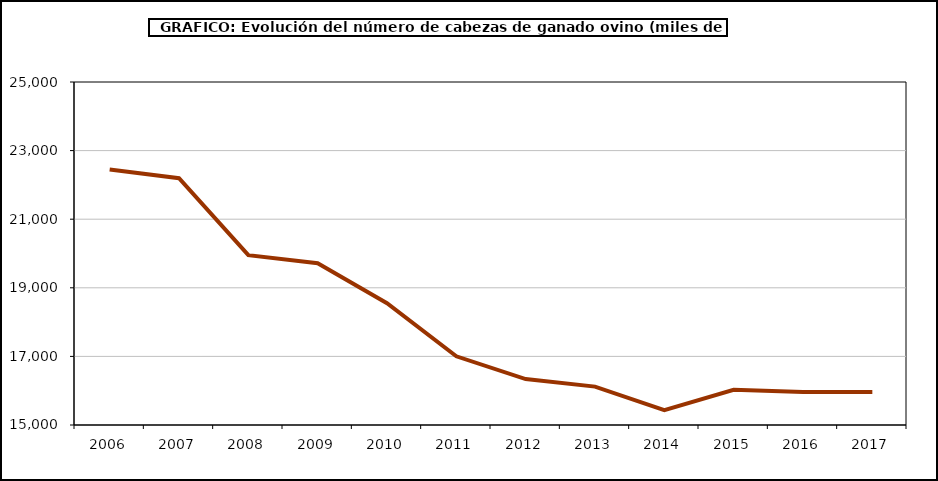
| Category | Series 0 |
|---|---|
| 2006.0 | 22451.627 |
| 2007.0 | 22194.257 |
| 2008.0 | 19952.282 |
| 2009.0 | 19718.195 |
| 2010.0 | 18552 |
| 2011.0 | 17003 |
| 2012.0 | 16339.373 |
| 2013.0 | 16118.586 |
| 2014.0 | 15431.804 |
| 2015.0 | 16026.374 |
| 2016.0 | 15962.892 |
| 2017.0 | 15963.106 |